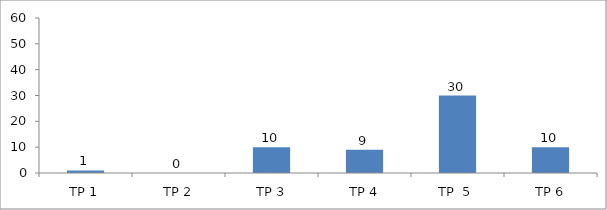
| Category | BIL. MURID |
|---|---|
| TP 1 | 1 |
| TP 2 | 0 |
|  TP 3 | 10 |
| TP 4 | 9 |
| TP  5 | 30 |
| TP 6 | 10 |